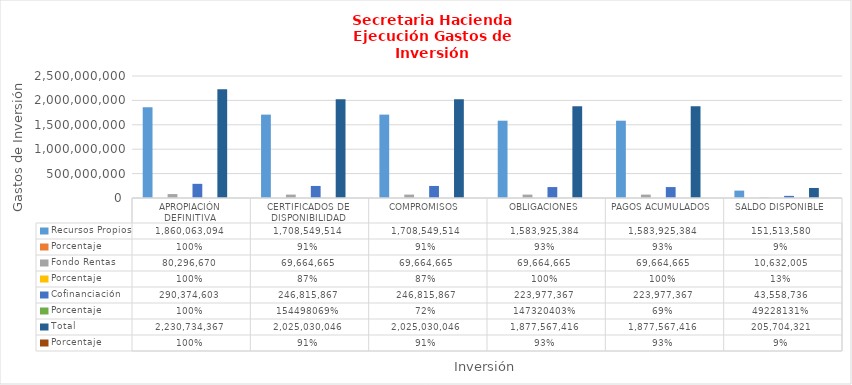
| Category | Recursos Propios | Porcentaje | Fondo Rentas | Cofinanciación  | Total |
|---|---|---|---|---|---|
| APROPIACIÓN DEFINITIVA  | 1860063094 | 1 | 80296670 | 290374603 | 2230734367 |
| CERTIFICADOS DE DISPONIBILIDAD | 1708549514 | 0.908 | 69664665 | 246815867 | 2025030046 |
| COMPROMISOS  | 1708549514 | 0.908 | 69664665 | 246815867 | 2025030046 |
| OBLIGACIONES | 1583925384 | 0.927 | 69664665 | 223977367 | 1877567416 |
| PAGOS ACUMULADOS | 1583925384 | 0.927 | 69664665 | 223977367 | 1877567416 |
| SALDO DISPONIBLE | 151513580 | 0.092 | 10632005 | 43558736 | 205704321 |